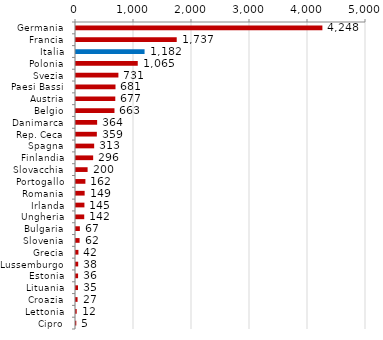
| Category | Series 0 |
|---|---|
| Germania | 4248.089 |
| Francia | 1736.658 |
| Italia | 1182.331 |
| Polonia | 1064.78 |
| Svezia | 730.988 |
| Paesi Bassi | 681.028 |
| Austria | 677.44 |
| Belgio | 663.342 |
| Danimarca | 364.491 |
| Rep. Ceca | 359.446 |
| Spagna | 313.318 |
| Finlandia | 295.858 |
| Slovacchia | 200.033 |
| Portogallo | 162.112 |
| Romania | 149.111 |
| Irlanda | 145.319 |
| Ungheria | 141.922 |
| Bulgaria | 66.527 |
| Slovenia | 62.033 |
| Grecia | 41.978 |
| Lussemburgo | 38.094 |
| Estonia | 36.067 |
| Lituania | 34.8 |
| Croazia | 26.963 |
| Lettonia | 12.01 |
| Cipro | 5.188 |